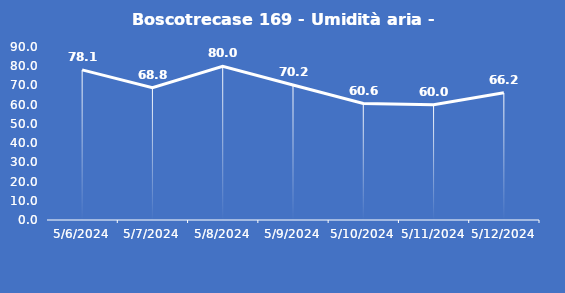
| Category | Boscotrecase 169 - Umidità aria - Grezzo (%) |
|---|---|
| 5/6/24 | 78.1 |
| 5/7/24 | 68.8 |
| 5/8/24 | 80 |
| 5/9/24 | 70.2 |
| 5/10/24 | 60.6 |
| 5/11/24 | 60 |
| 5/12/24 | 66.2 |